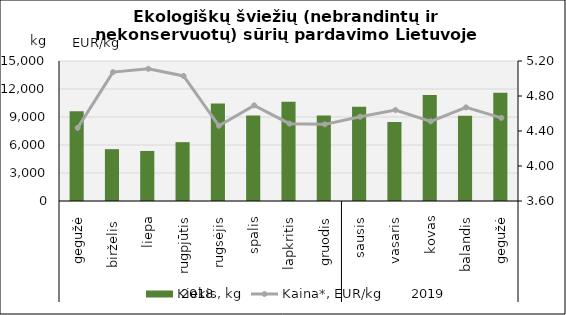
| Category | Kiekis, kg |
|---|---|
| 0 | 9617 |
| 1 | 5556 |
| 2 | 5361 |
| 3 | 6304 |
| 4 | 10457 |
| 5 | 9164 |
| 6 | 10630 |
| 7 | 9155 |
| 8 | 10096 |
| 9 | 8474 |
| 10 | 11358 |
| 11 | 9141 |
| 12 | 11603 |